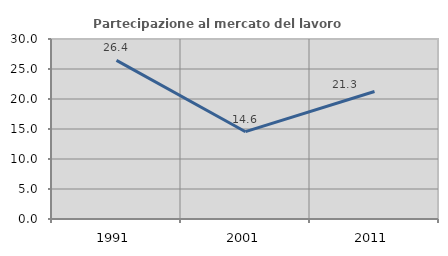
| Category | Partecipazione al mercato del lavoro  femminile |
|---|---|
| 1991.0 | 26.431 |
| 2001.0 | 14.552 |
| 2011.0 | 21.254 |